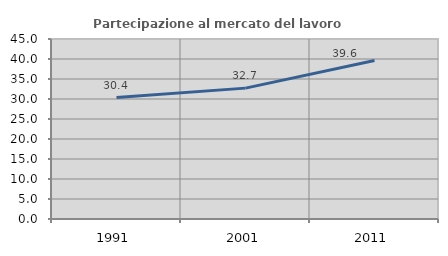
| Category | Partecipazione al mercato del lavoro  femminile |
|---|---|
| 1991.0 | 30.36 |
| 2001.0 | 32.718 |
| 2011.0 | 39.625 |